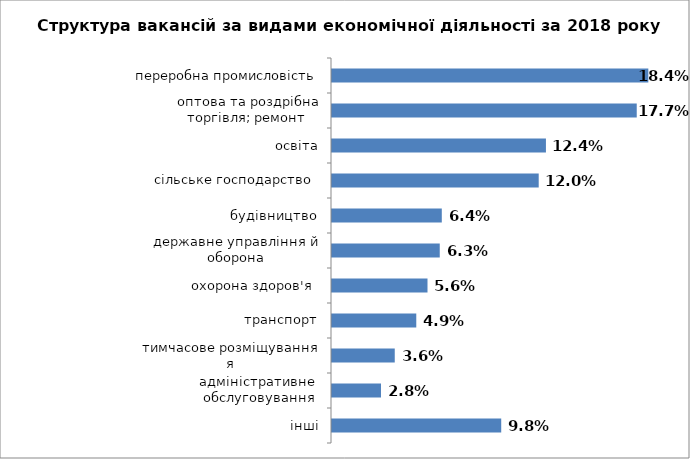
| Category | Series 0 |
|---|---|
| інші | 0.098 |
| адміністративне  обслуговування | 0.028 |
| тимчасове розміщування я | 0.036 |
| транспорт | 0.049 |
| охорона здоров'я  | 0.056 |
| державне управління й оборона | 0.063 |
| будівництво | 0.064 |
| сільське господарство  | 0.12 |
| освіта | 0.124 |
| оптова та роздрібна торгівля; ремонт  | 0.177 |
| переробна промисловість | 0.184 |